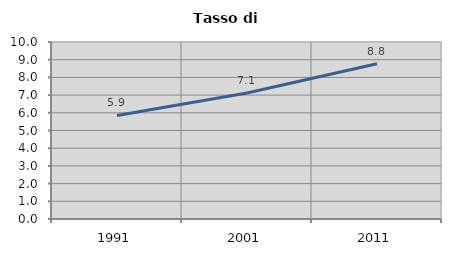
| Category | Tasso di disoccupazione   |
|---|---|
| 1991.0 | 5.851 |
| 2001.0 | 7.115 |
| 2011.0 | 8.772 |